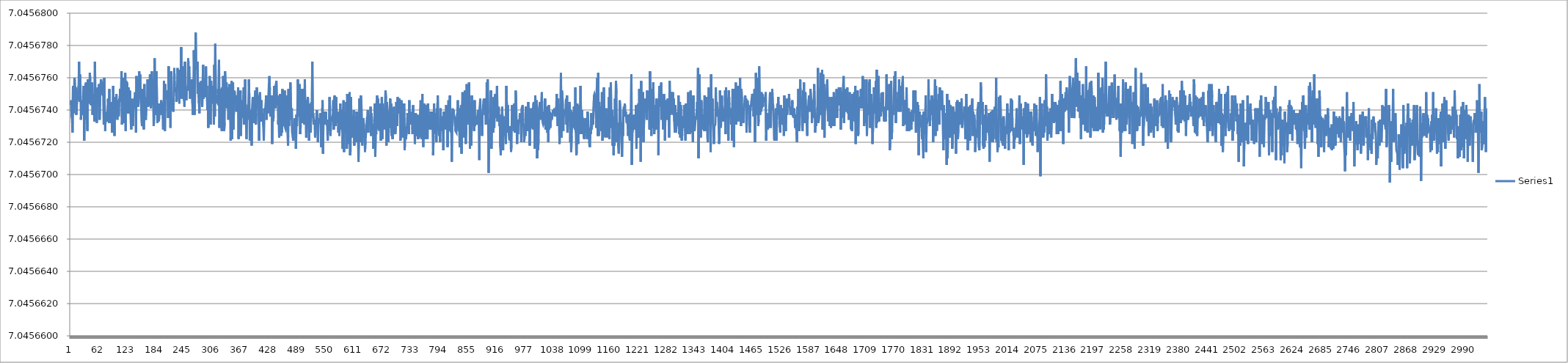
| Category | Series 0 |
|---|---|
| 0 | 7.046 |
| 1 | 7.046 |
| 2 | 7.046 |
| 3 | 7.046 |
| 4 | 7.046 |
| 5 | 7.046 |
| 6 | 7.046 |
| 7 | 7.046 |
| 8 | 7.046 |
| 9 | 7.046 |
| 10 | 7.046 |
| 11 | 7.046 |
| 12 | 7.046 |
| 13 | 7.046 |
| 14 | 7.046 |
| 15 | 7.046 |
| 16 | 7.046 |
| 17 | 7.046 |
| 18 | 7.046 |
| 19 | 7.046 |
| 20 | 7.046 |
| 21 | 7.046 |
| 22 | 7.046 |
| 23 | 7.046 |
| 24 | 7.046 |
| 25 | 7.046 |
| 26 | 7.046 |
| 27 | 7.046 |
| 28 | 7.046 |
| 29 | 7.046 |
| 30 | 7.046 |
| 31 | 7.046 |
| 32 | 7.046 |
| 33 | 7.046 |
| 34 | 7.046 |
| 35 | 7.046 |
| 36 | 7.046 |
| 37 | 7.046 |
| 38 | 7.046 |
| 39 | 7.046 |
| 40 | 7.046 |
| 41 | 7.046 |
| 42 | 7.046 |
| 43 | 7.046 |
| 44 | 7.046 |
| 45 | 7.046 |
| 46 | 7.046 |
| 47 | 7.046 |
| 48 | 7.046 |
| 49 | 7.046 |
| 50 | 7.046 |
| 51 | 7.046 |
| 52 | 7.046 |
| 53 | 7.046 |
| 54 | 7.046 |
| 55 | 7.046 |
| 56 | 7.046 |
| 57 | 7.046 |
| 58 | 7.046 |
| 59 | 7.046 |
| 60 | 7.046 |
| 61 | 7.046 |
| 62 | 7.046 |
| 63 | 7.046 |
| 64 | 7.046 |
| 65 | 7.046 |
| 66 | 7.046 |
| 67 | 7.046 |
| 68 | 7.046 |
| 69 | 7.046 |
| 70 | 7.046 |
| 71 | 7.046 |
| 72 | 7.046 |
| 73 | 7.046 |
| 74 | 7.046 |
| 75 | 7.046 |
| 76 | 7.046 |
| 77 | 7.046 |
| 78 | 7.046 |
| 79 | 7.046 |
| 80 | 7.046 |
| 81 | 7.046 |
| 82 | 7.046 |
| 83 | 7.046 |
| 84 | 7.046 |
| 85 | 7.046 |
| 86 | 7.046 |
| 87 | 7.046 |
| 88 | 7.046 |
| 89 | 7.046 |
| 90 | 7.046 |
| 91 | 7.046 |
| 92 | 7.046 |
| 93 | 7.046 |
| 94 | 7.046 |
| 95 | 7.046 |
| 96 | 7.046 |
| 97 | 7.046 |
| 98 | 7.046 |
| 99 | 7.046 |
| 100 | 7.046 |
| 101 | 7.046 |
| 102 | 7.046 |
| 103 | 7.046 |
| 104 | 7.046 |
| 105 | 7.046 |
| 106 | 7.046 |
| 107 | 7.046 |
| 108 | 7.046 |
| 109 | 7.046 |
| 110 | 7.046 |
| 111 | 7.046 |
| 112 | 7.046 |
| 113 | 7.046 |
| 114 | 7.046 |
| 115 | 7.046 |
| 116 | 7.046 |
| 117 | 7.046 |
| 118 | 7.046 |
| 119 | 7.046 |
| 120 | 7.046 |
| 121 | 7.046 |
| 122 | 7.046 |
| 123 | 7.046 |
| 124 | 7.046 |
| 125 | 7.046 |
| 126 | 7.046 |
| 127 | 7.046 |
| 128 | 7.046 |
| 129 | 7.046 |
| 130 | 7.046 |
| 131 | 7.046 |
| 132 | 7.046 |
| 133 | 7.046 |
| 134 | 7.046 |
| 135 | 7.046 |
| 136 | 7.046 |
| 137 | 7.046 |
| 138 | 7.046 |
| 139 | 7.046 |
| 140 | 7.046 |
| 141 | 7.046 |
| 142 | 7.046 |
| 143 | 7.046 |
| 144 | 7.046 |
| 145 | 7.046 |
| 146 | 7.046 |
| 147 | 7.046 |
| 148 | 7.046 |
| 149 | 7.046 |
| 150 | 7.046 |
| 151 | 7.046 |
| 152 | 7.046 |
| 153 | 7.046 |
| 154 | 7.046 |
| 155 | 7.046 |
| 156 | 7.046 |
| 157 | 7.046 |
| 158 | 7.046 |
| 159 | 7.046 |
| 160 | 7.046 |
| 161 | 7.046 |
| 162 | 7.046 |
| 163 | 7.046 |
| 164 | 7.046 |
| 165 | 7.046 |
| 166 | 7.046 |
| 167 | 7.046 |
| 168 | 7.046 |
| 169 | 7.046 |
| 170 | 7.046 |
| 171 | 7.046 |
| 172 | 7.046 |
| 173 | 7.046 |
| 174 | 7.046 |
| 175 | 7.046 |
| 176 | 7.046 |
| 177 | 7.046 |
| 178 | 7.046 |
| 179 | 7.046 |
| 180 | 7.046 |
| 181 | 7.046 |
| 182 | 7.046 |
| 183 | 7.046 |
| 184 | 7.046 |
| 185 | 7.046 |
| 186 | 7.046 |
| 187 | 7.046 |
| 188 | 7.046 |
| 189 | 7.046 |
| 190 | 7.046 |
| 191 | 7.046 |
| 192 | 7.046 |
| 193 | 7.046 |
| 194 | 7.046 |
| 195 | 7.046 |
| 196 | 7.046 |
| 197 | 7.046 |
| 198 | 7.046 |
| 199 | 7.046 |
| 200 | 7.046 |
| 201 | 7.046 |
| 202 | 7.046 |
| 203 | 7.046 |
| 204 | 7.046 |
| 205 | 7.046 |
| 206 | 7.046 |
| 207 | 7.046 |
| 208 | 7.046 |
| 209 | 7.046 |
| 210 | 7.046 |
| 211 | 7.046 |
| 212 | 7.046 |
| 213 | 7.046 |
| 214 | 7.046 |
| 215 | 7.046 |
| 216 | 7.046 |
| 217 | 7.046 |
| 218 | 7.046 |
| 219 | 7.046 |
| 220 | 7.046 |
| 221 | 7.046 |
| 222 | 7.046 |
| 223 | 7.046 |
| 224 | 7.046 |
| 225 | 7.046 |
| 226 | 7.046 |
| 227 | 7.046 |
| 228 | 7.046 |
| 229 | 7.046 |
| 230 | 7.046 |
| 231 | 7.046 |
| 232 | 7.046 |
| 233 | 7.046 |
| 234 | 7.046 |
| 235 | 7.046 |
| 236 | 7.046 |
| 237 | 7.046 |
| 238 | 7.046 |
| 239 | 7.046 |
| 240 | 7.046 |
| 241 | 7.046 |
| 242 | 7.046 |
| 243 | 7.046 |
| 244 | 7.046 |
| 245 | 7.046 |
| 246 | 7.046 |
| 247 | 7.046 |
| 248 | 7.046 |
| 249 | 7.046 |
| 250 | 7.046 |
| 251 | 7.046 |
| 252 | 7.046 |
| 253 | 7.046 |
| 254 | 7.046 |
| 255 | 7.046 |
| 256 | 7.046 |
| 257 | 7.046 |
| 258 | 7.046 |
| 259 | 7.046 |
| 260 | 7.046 |
| 261 | 7.046 |
| 262 | 7.046 |
| 263 | 7.046 |
| 264 | 7.046 |
| 265 | 7.046 |
| 266 | 7.046 |
| 267 | 7.046 |
| 268 | 7.046 |
| 269 | 7.046 |
| 270 | 7.046 |
| 271 | 7.046 |
| 272 | 7.046 |
| 273 | 7.046 |
| 274 | 7.046 |
| 275 | 7.046 |
| 276 | 7.046 |
| 277 | 7.046 |
| 278 | 7.046 |
| 279 | 7.046 |
| 280 | 7.046 |
| 281 | 7.046 |
| 282 | 7.046 |
| 283 | 7.046 |
| 284 | 7.046 |
| 285 | 7.046 |
| 286 | 7.046 |
| 287 | 7.046 |
| 288 | 7.046 |
| 289 | 7.046 |
| 290 | 7.046 |
| 291 | 7.046 |
| 292 | 7.046 |
| 293 | 7.046 |
| 294 | 7.046 |
| 295 | 7.046 |
| 296 | 7.046 |
| 297 | 7.046 |
| 298 | 7.046 |
| 299 | 7.046 |
| 300 | 7.046 |
| 301 | 7.046 |
| 302 | 7.046 |
| 303 | 7.046 |
| 304 | 7.046 |
| 305 | 7.046 |
| 306 | 7.046 |
| 307 | 7.046 |
| 308 | 7.046 |
| 309 | 7.046 |
| 310 | 7.046 |
| 311 | 7.046 |
| 312 | 7.046 |
| 313 | 7.046 |
| 314 | 7.046 |
| 315 | 7.046 |
| 316 | 7.046 |
| 317 | 7.046 |
| 318 | 7.046 |
| 319 | 7.046 |
| 320 | 7.046 |
| 321 | 7.046 |
| 322 | 7.046 |
| 323 | 7.046 |
| 324 | 7.046 |
| 325 | 7.046 |
| 326 | 7.046 |
| 327 | 7.046 |
| 328 | 7.046 |
| 329 | 7.046 |
| 330 | 7.046 |
| 331 | 7.046 |
| 332 | 7.046 |
| 333 | 7.046 |
| 334 | 7.046 |
| 335 | 7.046 |
| 336 | 7.046 |
| 337 | 7.046 |
| 338 | 7.046 |
| 339 | 7.046 |
| 340 | 7.046 |
| 341 | 7.046 |
| 342 | 7.046 |
| 343 | 7.046 |
| 344 | 7.046 |
| 345 | 7.046 |
| 346 | 7.046 |
| 347 | 7.046 |
| 348 | 7.046 |
| 349 | 7.046 |
| 350 | 7.046 |
| 351 | 7.046 |
| 352 | 7.046 |
| 353 | 7.046 |
| 354 | 7.046 |
| 355 | 7.046 |
| 356 | 7.046 |
| 357 | 7.046 |
| 358 | 7.046 |
| 359 | 7.046 |
| 360 | 7.046 |
| 361 | 7.046 |
| 362 | 7.046 |
| 363 | 7.046 |
| 364 | 7.046 |
| 365 | 7.046 |
| 366 | 7.046 |
| 367 | 7.046 |
| 368 | 7.046 |
| 369 | 7.046 |
| 370 | 7.046 |
| 371 | 7.046 |
| 372 | 7.046 |
| 373 | 7.046 |
| 374 | 7.046 |
| 375 | 7.046 |
| 376 | 7.046 |
| 377 | 7.046 |
| 378 | 7.046 |
| 379 | 7.046 |
| 380 | 7.046 |
| 381 | 7.046 |
| 382 | 7.046 |
| 383 | 7.046 |
| 384 | 7.046 |
| 385 | 7.046 |
| 386 | 7.046 |
| 387 | 7.046 |
| 388 | 7.046 |
| 389 | 7.046 |
| 390 | 7.046 |
| 391 | 7.046 |
| 392 | 7.046 |
| 393 | 7.046 |
| 394 | 7.046 |
| 395 | 7.046 |
| 396 | 7.046 |
| 397 | 7.046 |
| 398 | 7.046 |
| 399 | 7.046 |
| 400 | 7.046 |
| 401 | 7.046 |
| 402 | 7.046 |
| 403 | 7.046 |
| 404 | 7.046 |
| 405 | 7.046 |
| 406 | 7.046 |
| 407 | 7.046 |
| 408 | 7.046 |
| 409 | 7.046 |
| 410 | 7.046 |
| 411 | 7.046 |
| 412 | 7.046 |
| 413 | 7.046 |
| 414 | 7.046 |
| 415 | 7.046 |
| 416 | 7.046 |
| 417 | 7.046 |
| 418 | 7.046 |
| 419 | 7.046 |
| 420 | 7.046 |
| 421 | 7.046 |
| 422 | 7.046 |
| 423 | 7.046 |
| 424 | 7.046 |
| 425 | 7.046 |
| 426 | 7.046 |
| 427 | 7.046 |
| 428 | 7.046 |
| 429 | 7.046 |
| 430 | 7.046 |
| 431 | 7.046 |
| 432 | 7.046 |
| 433 | 7.046 |
| 434 | 7.046 |
| 435 | 7.046 |
| 436 | 7.046 |
| 437 | 7.046 |
| 438 | 7.046 |
| 439 | 7.046 |
| 440 | 7.046 |
| 441 | 7.046 |
| 442 | 7.046 |
| 443 | 7.046 |
| 444 | 7.046 |
| 445 | 7.046 |
| 446 | 7.046 |
| 447 | 7.046 |
| 448 | 7.046 |
| 449 | 7.046 |
| 450 | 7.046 |
| 451 | 7.046 |
| 452 | 7.046 |
| 453 | 7.046 |
| 454 | 7.046 |
| 455 | 7.046 |
| 456 | 7.046 |
| 457 | 7.046 |
| 458 | 7.046 |
| 459 | 7.046 |
| 460 | 7.046 |
| 461 | 7.046 |
| 462 | 7.046 |
| 463 | 7.046 |
| 464 | 7.046 |
| 465 | 7.046 |
| 466 | 7.046 |
| 467 | 7.046 |
| 468 | 7.046 |
| 469 | 7.046 |
| 470 | 7.046 |
| 471 | 7.046 |
| 472 | 7.046 |
| 473 | 7.046 |
| 474 | 7.046 |
| 475 | 7.046 |
| 476 | 7.046 |
| 477 | 7.046 |
| 478 | 7.046 |
| 479 | 7.046 |
| 480 | 7.046 |
| 481 | 7.046 |
| 482 | 7.046 |
| 483 | 7.046 |
| 484 | 7.046 |
| 485 | 7.046 |
| 486 | 7.046 |
| 487 | 7.046 |
| 488 | 7.046 |
| 489 | 7.046 |
| 490 | 7.046 |
| 491 | 7.046 |
| 492 | 7.046 |
| 493 | 7.046 |
| 494 | 7.046 |
| 495 | 7.046 |
| 496 | 7.046 |
| 497 | 7.046 |
| 498 | 7.046 |
| 499 | 7.046 |
| 500 | 7.046 |
| 501 | 7.046 |
| 502 | 7.046 |
| 503 | 7.046 |
| 504 | 7.046 |
| 505 | 7.046 |
| 506 | 7.046 |
| 507 | 7.046 |
| 508 | 7.046 |
| 509 | 7.046 |
| 510 | 7.046 |
| 511 | 7.046 |
| 512 | 7.046 |
| 513 | 7.046 |
| 514 | 7.046 |
| 515 | 7.046 |
| 516 | 7.046 |
| 517 | 7.046 |
| 518 | 7.046 |
| 519 | 7.046 |
| 520 | 7.046 |
| 521 | 7.046 |
| 522 | 7.046 |
| 523 | 7.046 |
| 524 | 7.046 |
| 525 | 7.046 |
| 526 | 7.046 |
| 527 | 7.046 |
| 528 | 7.046 |
| 529 | 7.046 |
| 530 | 7.046 |
| 531 | 7.046 |
| 532 | 7.046 |
| 533 | 7.046 |
| 534 | 7.046 |
| 535 | 7.046 |
| 536 | 7.046 |
| 537 | 7.046 |
| 538 | 7.046 |
| 539 | 7.046 |
| 540 | 7.046 |
| 541 | 7.046 |
| 542 | 7.046 |
| 543 | 7.046 |
| 544 | 7.046 |
| 545 | 7.046 |
| 546 | 7.046 |
| 547 | 7.046 |
| 548 | 7.046 |
| 549 | 7.046 |
| 550 | 7.046 |
| 551 | 7.046 |
| 552 | 7.046 |
| 553 | 7.046 |
| 554 | 7.046 |
| 555 | 7.046 |
| 556 | 7.046 |
| 557 | 7.046 |
| 558 | 7.046 |
| 559 | 7.046 |
| 560 | 7.046 |
| 561 | 7.046 |
| 562 | 7.046 |
| 563 | 7.046 |
| 564 | 7.046 |
| 565 | 7.046 |
| 566 | 7.046 |
| 567 | 7.046 |
| 568 | 7.046 |
| 569 | 7.046 |
| 570 | 7.046 |
| 571 | 7.046 |
| 572 | 7.046 |
| 573 | 7.046 |
| 574 | 7.046 |
| 575 | 7.046 |
| 576 | 7.046 |
| 577 | 7.046 |
| 578 | 7.046 |
| 579 | 7.046 |
| 580 | 7.046 |
| 581 | 7.046 |
| 582 | 7.046 |
| 583 | 7.046 |
| 584 | 7.046 |
| 585 | 7.046 |
| 586 | 7.046 |
| 587 | 7.046 |
| 588 | 7.046 |
| 589 | 7.046 |
| 590 | 7.046 |
| 591 | 7.046 |
| 592 | 7.046 |
| 593 | 7.046 |
| 594 | 7.046 |
| 595 | 7.046 |
| 596 | 7.046 |
| 597 | 7.046 |
| 598 | 7.046 |
| 599 | 7.046 |
| 600 | 7.046 |
| 601 | 7.046 |
| 602 | 7.046 |
| 603 | 7.046 |
| 604 | 7.046 |
| 605 | 7.046 |
| 606 | 7.046 |
| 607 | 7.046 |
| 608 | 7.046 |
| 609 | 7.046 |
| 610 | 7.046 |
| 611 | 7.046 |
| 612 | 7.046 |
| 613 | 7.046 |
| 614 | 7.046 |
| 615 | 7.046 |
| 616 | 7.046 |
| 617 | 7.046 |
| 618 | 7.046 |
| 619 | 7.046 |
| 620 | 7.046 |
| 621 | 7.046 |
| 622 | 7.046 |
| 623 | 7.046 |
| 624 | 7.046 |
| 625 | 7.046 |
| 626 | 7.046 |
| 627 | 7.046 |
| 628 | 7.046 |
| 629 | 7.046 |
| 630 | 7.046 |
| 631 | 7.046 |
| 632 | 7.046 |
| 633 | 7.046 |
| 634 | 7.046 |
| 635 | 7.046 |
| 636 | 7.046 |
| 637 | 7.046 |
| 638 | 7.046 |
| 639 | 7.046 |
| 640 | 7.046 |
| 641 | 7.046 |
| 642 | 7.046 |
| 643 | 7.046 |
| 644 | 7.046 |
| 645 | 7.046 |
| 646 | 7.046 |
| 647 | 7.046 |
| 648 | 7.046 |
| 649 | 7.046 |
| 650 | 7.046 |
| 651 | 7.046 |
| 652 | 7.046 |
| 653 | 7.046 |
| 654 | 7.046 |
| 655 | 7.046 |
| 656 | 7.046 |
| 657 | 7.046 |
| 658 | 7.046 |
| 659 | 7.046 |
| 660 | 7.046 |
| 661 | 7.046 |
| 662 | 7.046 |
| 663 | 7.046 |
| 664 | 7.046 |
| 665 | 7.046 |
| 666 | 7.046 |
| 667 | 7.046 |
| 668 | 7.046 |
| 669 | 7.046 |
| 670 | 7.046 |
| 671 | 7.046 |
| 672 | 7.046 |
| 673 | 7.046 |
| 674 | 7.046 |
| 675 | 7.046 |
| 676 | 7.046 |
| 677 | 7.046 |
| 678 | 7.046 |
| 679 | 7.046 |
| 680 | 7.046 |
| 681 | 7.046 |
| 682 | 7.046 |
| 683 | 7.046 |
| 684 | 7.046 |
| 685 | 7.046 |
| 686 | 7.046 |
| 687 | 7.046 |
| 688 | 7.046 |
| 689 | 7.046 |
| 690 | 7.046 |
| 691 | 7.046 |
| 692 | 7.046 |
| 693 | 7.046 |
| 694 | 7.046 |
| 695 | 7.046 |
| 696 | 7.046 |
| 697 | 7.046 |
| 698 | 7.046 |
| 699 | 7.046 |
| 700 | 7.046 |
| 701 | 7.046 |
| 702 | 7.046 |
| 703 | 7.046 |
| 704 | 7.046 |
| 705 | 7.046 |
| 706 | 7.046 |
| 707 | 7.046 |
| 708 | 7.046 |
| 709 | 7.046 |
| 710 | 7.046 |
| 711 | 7.046 |
| 712 | 7.046 |
| 713 | 7.046 |
| 714 | 7.046 |
| 715 | 7.046 |
| 716 | 7.046 |
| 717 | 7.046 |
| 718 | 7.046 |
| 719 | 7.046 |
| 720 | 7.046 |
| 721 | 7.046 |
| 722 | 7.046 |
| 723 | 7.046 |
| 724 | 7.046 |
| 725 | 7.046 |
| 726 | 7.046 |
| 727 | 7.046 |
| 728 | 7.046 |
| 729 | 7.046 |
| 730 | 7.046 |
| 731 | 7.046 |
| 732 | 7.046 |
| 733 | 7.046 |
| 734 | 7.046 |
| 735 | 7.046 |
| 736 | 7.046 |
| 737 | 7.046 |
| 738 | 7.046 |
| 739 | 7.046 |
| 740 | 7.046 |
| 741 | 7.046 |
| 742 | 7.046 |
| 743 | 7.046 |
| 744 | 7.046 |
| 745 | 7.046 |
| 746 | 7.046 |
| 747 | 7.046 |
| 748 | 7.046 |
| 749 | 7.046 |
| 750 | 7.046 |
| 751 | 7.046 |
| 752 | 7.046 |
| 753 | 7.046 |
| 754 | 7.046 |
| 755 | 7.046 |
| 756 | 7.046 |
| 757 | 7.046 |
| 758 | 7.046 |
| 759 | 7.046 |
| 760 | 7.046 |
| 761 | 7.046 |
| 762 | 7.046 |
| 763 | 7.046 |
| 764 | 7.046 |
| 765 | 7.046 |
| 766 | 7.046 |
| 767 | 7.046 |
| 768 | 7.046 |
| 769 | 7.046 |
| 770 | 7.046 |
| 771 | 7.046 |
| 772 | 7.046 |
| 773 | 7.046 |
| 774 | 7.046 |
| 775 | 7.046 |
| 776 | 7.046 |
| 777 | 7.046 |
| 778 | 7.046 |
| 779 | 7.046 |
| 780 | 7.046 |
| 781 | 7.046 |
| 782 | 7.046 |
| 783 | 7.046 |
| 784 | 7.046 |
| 785 | 7.046 |
| 786 | 7.046 |
| 787 | 7.046 |
| 788 | 7.046 |
| 789 | 7.046 |
| 790 | 7.046 |
| 791 | 7.046 |
| 792 | 7.046 |
| 793 | 7.046 |
| 794 | 7.046 |
| 795 | 7.046 |
| 796 | 7.046 |
| 797 | 7.046 |
| 798 | 7.046 |
| 799 | 7.046 |
| 800 | 7.046 |
| 801 | 7.046 |
| 802 | 7.046 |
| 803 | 7.046 |
| 804 | 7.046 |
| 805 | 7.046 |
| 806 | 7.046 |
| 807 | 7.046 |
| 808 | 7.046 |
| 809 | 7.046 |
| 810 | 7.046 |
| 811 | 7.046 |
| 812 | 7.046 |
| 813 | 7.046 |
| 814 | 7.046 |
| 815 | 7.046 |
| 816 | 7.046 |
| 817 | 7.046 |
| 818 | 7.046 |
| 819 | 7.046 |
| 820 | 7.046 |
| 821 | 7.046 |
| 822 | 7.046 |
| 823 | 7.046 |
| 824 | 7.046 |
| 825 | 7.046 |
| 826 | 7.046 |
| 827 | 7.046 |
| 828 | 7.046 |
| 829 | 7.046 |
| 830 | 7.046 |
| 831 | 7.046 |
| 832 | 7.046 |
| 833 | 7.046 |
| 834 | 7.046 |
| 835 | 7.046 |
| 836 | 7.046 |
| 837 | 7.046 |
| 838 | 7.046 |
| 839 | 7.046 |
| 840 | 7.046 |
| 841 | 7.046 |
| 842 | 7.046 |
| 843 | 7.046 |
| 844 | 7.046 |
| 845 | 7.046 |
| 846 | 7.046 |
| 847 | 7.046 |
| 848 | 7.046 |
| 849 | 7.046 |
| 850 | 7.046 |
| 851 | 7.046 |
| 852 | 7.046 |
| 853 | 7.046 |
| 854 | 7.046 |
| 855 | 7.046 |
| 856 | 7.046 |
| 857 | 7.046 |
| 858 | 7.046 |
| 859 | 7.046 |
| 860 | 7.046 |
| 861 | 7.046 |
| 862 | 7.046 |
| 863 | 7.046 |
| 864 | 7.046 |
| 865 | 7.046 |
| 866 | 7.046 |
| 867 | 7.046 |
| 868 | 7.046 |
| 869 | 7.046 |
| 870 | 7.046 |
| 871 | 7.046 |
| 872 | 7.046 |
| 873 | 7.046 |
| 874 | 7.046 |
| 875 | 7.046 |
| 876 | 7.046 |
| 877 | 7.046 |
| 878 | 7.046 |
| 879 | 7.046 |
| 880 | 7.046 |
| 881 | 7.046 |
| 882 | 7.046 |
| 883 | 7.046 |
| 884 | 7.046 |
| 885 | 7.046 |
| 886 | 7.046 |
| 887 | 7.046 |
| 888 | 7.046 |
| 889 | 7.046 |
| 890 | 7.046 |
| 891 | 7.046 |
| 892 | 7.046 |
| 893 | 7.046 |
| 894 | 7.046 |
| 895 | 7.046 |
| 896 | 7.046 |
| 897 | 7.046 |
| 898 | 7.046 |
| 899 | 7.046 |
| 900 | 7.046 |
| 901 | 7.046 |
| 902 | 7.046 |
| 903 | 7.046 |
| 904 | 7.046 |
| 905 | 7.046 |
| 906 | 7.046 |
| 907 | 7.046 |
| 908 | 7.046 |
| 909 | 7.046 |
| 910 | 7.046 |
| 911 | 7.046 |
| 912 | 7.046 |
| 913 | 7.046 |
| 914 | 7.046 |
| 915 | 7.046 |
| 916 | 7.046 |
| 917 | 7.046 |
| 918 | 7.046 |
| 919 | 7.046 |
| 920 | 7.046 |
| 921 | 7.046 |
| 922 | 7.046 |
| 923 | 7.046 |
| 924 | 7.046 |
| 925 | 7.046 |
| 926 | 7.046 |
| 927 | 7.046 |
| 928 | 7.046 |
| 929 | 7.046 |
| 930 | 7.046 |
| 931 | 7.046 |
| 932 | 7.046 |
| 933 | 7.046 |
| 934 | 7.046 |
| 935 | 7.046 |
| 936 | 7.046 |
| 937 | 7.046 |
| 938 | 7.046 |
| 939 | 7.046 |
| 940 | 7.046 |
| 941 | 7.046 |
| 942 | 7.046 |
| 943 | 7.046 |
| 944 | 7.046 |
| 945 | 7.046 |
| 946 | 7.046 |
| 947 | 7.046 |
| 948 | 7.046 |
| 949 | 7.046 |
| 950 | 7.046 |
| 951 | 7.046 |
| 952 | 7.046 |
| 953 | 7.046 |
| 954 | 7.046 |
| 955 | 7.046 |
| 956 | 7.046 |
| 957 | 7.046 |
| 958 | 7.046 |
| 959 | 7.046 |
| 960 | 7.046 |
| 961 | 7.046 |
| 962 | 7.046 |
| 963 | 7.046 |
| 964 | 7.046 |
| 965 | 7.046 |
| 966 | 7.046 |
| 967 | 7.046 |
| 968 | 7.046 |
| 969 | 7.046 |
| 970 | 7.046 |
| 971 | 7.046 |
| 972 | 7.046 |
| 973 | 7.046 |
| 974 | 7.046 |
| 975 | 7.046 |
| 976 | 7.046 |
| 977 | 7.046 |
| 978 | 7.046 |
| 979 | 7.046 |
| 980 | 7.046 |
| 981 | 7.046 |
| 982 | 7.046 |
| 983 | 7.046 |
| 984 | 7.046 |
| 985 | 7.046 |
| 986 | 7.046 |
| 987 | 7.046 |
| 988 | 7.046 |
| 989 | 7.046 |
| 990 | 7.046 |
| 991 | 7.046 |
| 992 | 7.046 |
| 993 | 7.046 |
| 994 | 7.046 |
| 995 | 7.046 |
| 996 | 7.046 |
| 997 | 7.046 |
| 998 | 7.046 |
| 999 | 7.046 |
| 1000 | 7.046 |
| 1001 | 7.046 |
| 1002 | 7.046 |
| 1003 | 7.046 |
| 1004 | 7.046 |
| 1005 | 7.046 |
| 1006 | 7.046 |
| 1007 | 7.046 |
| 1008 | 7.046 |
| 1009 | 7.046 |
| 1010 | 7.046 |
| 1011 | 7.046 |
| 1012 | 7.046 |
| 1013 | 7.046 |
| 1014 | 7.046 |
| 1015 | 7.046 |
| 1016 | 7.046 |
| 1017 | 7.046 |
| 1018 | 7.046 |
| 1019 | 7.046 |
| 1020 | 7.046 |
| 1021 | 7.046 |
| 1022 | 7.046 |
| 1023 | 7.046 |
| 1024 | 7.046 |
| 1025 | 7.046 |
| 1026 | 7.046 |
| 1027 | 7.046 |
| 1028 | 7.046 |
| 1029 | 7.046 |
| 1030 | 7.046 |
| 1031 | 7.046 |
| 1032 | 7.046 |
| 1033 | 7.046 |
| 1034 | 7.046 |
| 1035 | 7.046 |
| 1036 | 7.046 |
| 1037 | 7.046 |
| 1038 | 7.046 |
| 1039 | 7.046 |
| 1040 | 7.046 |
| 1041 | 7.046 |
| 1042 | 7.046 |
| 1043 | 7.046 |
| 1044 | 7.046 |
| 1045 | 7.046 |
| 1046 | 7.046 |
| 1047 | 7.046 |
| 1048 | 7.046 |
| 1049 | 7.046 |
| 1050 | 7.046 |
| 1051 | 7.046 |
| 1052 | 7.046 |
| 1053 | 7.046 |
| 1054 | 7.046 |
| 1055 | 7.046 |
| 1056 | 7.046 |
| 1057 | 7.046 |
| 1058 | 7.046 |
| 1059 | 7.046 |
| 1060 | 7.046 |
| 1061 | 7.046 |
| 1062 | 7.046 |
| 1063 | 7.046 |
| 1064 | 7.046 |
| 1065 | 7.046 |
| 1066 | 7.046 |
| 1067 | 7.046 |
| 1068 | 7.046 |
| 1069 | 7.046 |
| 1070 | 7.046 |
| 1071 | 7.046 |
| 1072 | 7.046 |
| 1073 | 7.046 |
| 1074 | 7.046 |
| 1075 | 7.046 |
| 1076 | 7.046 |
| 1077 | 7.046 |
| 1078 | 7.046 |
| 1079 | 7.046 |
| 1080 | 7.046 |
| 1081 | 7.046 |
| 1082 | 7.046 |
| 1083 | 7.046 |
| 1084 | 7.046 |
| 1085 | 7.046 |
| 1086 | 7.046 |
| 1087 | 7.046 |
| 1088 | 7.046 |
| 1089 | 7.046 |
| 1090 | 7.046 |
| 1091 | 7.046 |
| 1092 | 7.046 |
| 1093 | 7.046 |
| 1094 | 7.046 |
| 1095 | 7.046 |
| 1096 | 7.046 |
| 1097 | 7.046 |
| 1098 | 7.046 |
| 1099 | 7.046 |
| 1100 | 7.046 |
| 1101 | 7.046 |
| 1102 | 7.046 |
| 1103 | 7.046 |
| 1104 | 7.046 |
| 1105 | 7.046 |
| 1106 | 7.046 |
| 1107 | 7.046 |
| 1108 | 7.046 |
| 1109 | 7.046 |
| 1110 | 7.046 |
| 1111 | 7.046 |
| 1112 | 7.046 |
| 1113 | 7.046 |
| 1114 | 7.046 |
| 1115 | 7.046 |
| 1116 | 7.046 |
| 1117 | 7.046 |
| 1118 | 7.046 |
| 1119 | 7.046 |
| 1120 | 7.046 |
| 1121 | 7.046 |
| 1122 | 7.046 |
| 1123 | 7.046 |
| 1124 | 7.046 |
| 1125 | 7.046 |
| 1126 | 7.046 |
| 1127 | 7.046 |
| 1128 | 7.046 |
| 1129 | 7.046 |
| 1130 | 7.046 |
| 1131 | 7.046 |
| 1132 | 7.046 |
| 1133 | 7.046 |
| 1134 | 7.046 |
| 1135 | 7.046 |
| 1136 | 7.046 |
| 1137 | 7.046 |
| 1138 | 7.046 |
| 1139 | 7.046 |
| 1140 | 7.046 |
| 1141 | 7.046 |
| 1142 | 7.046 |
| 1143 | 7.046 |
| 1144 | 7.046 |
| 1145 | 7.046 |
| 1146 | 7.046 |
| 1147 | 7.046 |
| 1148 | 7.046 |
| 1149 | 7.046 |
| 1150 | 7.046 |
| 1151 | 7.046 |
| 1152 | 7.046 |
| 1153 | 7.046 |
| 1154 | 7.046 |
| 1155 | 7.046 |
| 1156 | 7.046 |
| 1157 | 7.046 |
| 1158 | 7.046 |
| 1159 | 7.046 |
| 1160 | 7.046 |
| 1161 | 7.046 |
| 1162 | 7.046 |
| 1163 | 7.046 |
| 1164 | 7.046 |
| 1165 | 7.046 |
| 1166 | 7.046 |
| 1167 | 7.046 |
| 1168 | 7.046 |
| 1169 | 7.046 |
| 1170 | 7.046 |
| 1171 | 7.046 |
| 1172 | 7.046 |
| 1173 | 7.046 |
| 1174 | 7.046 |
| 1175 | 7.046 |
| 1176 | 7.046 |
| 1177 | 7.046 |
| 1178 | 7.046 |
| 1179 | 7.046 |
| 1180 | 7.046 |
| 1181 | 7.046 |
| 1182 | 7.046 |
| 1183 | 7.046 |
| 1184 | 7.046 |
| 1185 | 7.046 |
| 1186 | 7.046 |
| 1187 | 7.046 |
| 1188 | 7.046 |
| 1189 | 7.046 |
| 1190 | 7.046 |
| 1191 | 7.046 |
| 1192 | 7.046 |
| 1193 | 7.046 |
| 1194 | 7.046 |
| 1195 | 7.046 |
| 1196 | 7.046 |
| 1197 | 7.046 |
| 1198 | 7.046 |
| 1199 | 7.046 |
| 1200 | 7.046 |
| 1201 | 7.046 |
| 1202 | 7.046 |
| 1203 | 7.046 |
| 1204 | 7.046 |
| 1205 | 7.046 |
| 1206 | 7.046 |
| 1207 | 7.046 |
| 1208 | 7.046 |
| 1209 | 7.046 |
| 1210 | 7.046 |
| 1211 | 7.046 |
| 1212 | 7.046 |
| 1213 | 7.046 |
| 1214 | 7.046 |
| 1215 | 7.046 |
| 1216 | 7.046 |
| 1217 | 7.046 |
| 1218 | 7.046 |
| 1219 | 7.046 |
| 1220 | 7.046 |
| 1221 | 7.046 |
| 1222 | 7.046 |
| 1223 | 7.046 |
| 1224 | 7.046 |
| 1225 | 7.046 |
| 1226 | 7.046 |
| 1227 | 7.046 |
| 1228 | 7.046 |
| 1229 | 7.046 |
| 1230 | 7.046 |
| 1231 | 7.046 |
| 1232 | 7.046 |
| 1233 | 7.046 |
| 1234 | 7.046 |
| 1235 | 7.046 |
| 1236 | 7.046 |
| 1237 | 7.046 |
| 1238 | 7.046 |
| 1239 | 7.046 |
| 1240 | 7.046 |
| 1241 | 7.046 |
| 1242 | 7.046 |
| 1243 | 7.046 |
| 1244 | 7.046 |
| 1245 | 7.046 |
| 1246 | 7.046 |
| 1247 | 7.046 |
| 1248 | 7.046 |
| 1249 | 7.046 |
| 1250 | 7.046 |
| 1251 | 7.046 |
| 1252 | 7.046 |
| 1253 | 7.046 |
| 1254 | 7.046 |
| 1255 | 7.046 |
| 1256 | 7.046 |
| 1257 | 7.046 |
| 1258 | 7.046 |
| 1259 | 7.046 |
| 1260 | 7.046 |
| 1261 | 7.046 |
| 1262 | 7.046 |
| 1263 | 7.046 |
| 1264 | 7.046 |
| 1265 | 7.046 |
| 1266 | 7.046 |
| 1267 | 7.046 |
| 1268 | 7.046 |
| 1269 | 7.046 |
| 1270 | 7.046 |
| 1271 | 7.046 |
| 1272 | 7.046 |
| 1273 | 7.046 |
| 1274 | 7.046 |
| 1275 | 7.046 |
| 1276 | 7.046 |
| 1277 | 7.046 |
| 1278 | 7.046 |
| 1279 | 7.046 |
| 1280 | 7.046 |
| 1281 | 7.046 |
| 1282 | 7.046 |
| 1283 | 7.046 |
| 1284 | 7.046 |
| 1285 | 7.046 |
| 1286 | 7.046 |
| 1287 | 7.046 |
| 1288 | 7.046 |
| 1289 | 7.046 |
| 1290 | 7.046 |
| 1291 | 7.046 |
| 1292 | 7.046 |
| 1293 | 7.046 |
| 1294 | 7.046 |
| 1295 | 7.046 |
| 1296 | 7.046 |
| 1297 | 7.046 |
| 1298 | 7.046 |
| 1299 | 7.046 |
| 1300 | 7.046 |
| 1301 | 7.046 |
| 1302 | 7.046 |
| 1303 | 7.046 |
| 1304 | 7.046 |
| 1305 | 7.046 |
| 1306 | 7.046 |
| 1307 | 7.046 |
| 1308 | 7.046 |
| 1309 | 7.046 |
| 1310 | 7.046 |
| 1311 | 7.046 |
| 1312 | 7.046 |
| 1313 | 7.046 |
| 1314 | 7.046 |
| 1315 | 7.046 |
| 1316 | 7.046 |
| 1317 | 7.046 |
| 1318 | 7.046 |
| 1319 | 7.046 |
| 1320 | 7.046 |
| 1321 | 7.046 |
| 1322 | 7.046 |
| 1323 | 7.046 |
| 1324 | 7.046 |
| 1325 | 7.046 |
| 1326 | 7.046 |
| 1327 | 7.046 |
| 1328 | 7.046 |
| 1329 | 7.046 |
| 1330 | 7.046 |
| 1331 | 7.046 |
| 1332 | 7.046 |
| 1333 | 7.046 |
| 1334 | 7.046 |
| 1335 | 7.046 |
| 1336 | 7.046 |
| 1337 | 7.046 |
| 1338 | 7.046 |
| 1339 | 7.046 |
| 1340 | 7.046 |
| 1341 | 7.046 |
| 1342 | 7.046 |
| 1343 | 7.046 |
| 1344 | 7.046 |
| 1345 | 7.046 |
| 1346 | 7.046 |
| 1347 | 7.046 |
| 1348 | 7.046 |
| 1349 | 7.046 |
| 1350 | 7.046 |
| 1351 | 7.046 |
| 1352 | 7.046 |
| 1353 | 7.046 |
| 1354 | 7.046 |
| 1355 | 7.046 |
| 1356 | 7.046 |
| 1357 | 7.046 |
| 1358 | 7.046 |
| 1359 | 7.046 |
| 1360 | 7.046 |
| 1361 | 7.046 |
| 1362 | 7.046 |
| 1363 | 7.046 |
| 1364 | 7.046 |
| 1365 | 7.046 |
| 1366 | 7.046 |
| 1367 | 7.046 |
| 1368 | 7.046 |
| 1369 | 7.046 |
| 1370 | 7.046 |
| 1371 | 7.046 |
| 1372 | 7.046 |
| 1373 | 7.046 |
| 1374 | 7.046 |
| 1375 | 7.046 |
| 1376 | 7.046 |
| 1377 | 7.046 |
| 1378 | 7.046 |
| 1379 | 7.046 |
| 1380 | 7.046 |
| 1381 | 7.046 |
| 1382 | 7.046 |
| 1383 | 7.046 |
| 1384 | 7.046 |
| 1385 | 7.046 |
| 1386 | 7.046 |
| 1387 | 7.046 |
| 1388 | 7.046 |
| 1389 | 7.046 |
| 1390 | 7.046 |
| 1391 | 7.046 |
| 1392 | 7.046 |
| 1393 | 7.046 |
| 1394 | 7.046 |
| 1395 | 7.046 |
| 1396 | 7.046 |
| 1397 | 7.046 |
| 1398 | 7.046 |
| 1399 | 7.046 |
| 1400 | 7.046 |
| 1401 | 7.046 |
| 1402 | 7.046 |
| 1403 | 7.046 |
| 1404 | 7.046 |
| 1405 | 7.046 |
| 1406 | 7.046 |
| 1407 | 7.046 |
| 1408 | 7.046 |
| 1409 | 7.046 |
| 1410 | 7.046 |
| 1411 | 7.046 |
| 1412 | 7.046 |
| 1413 | 7.046 |
| 1414 | 7.046 |
| 1415 | 7.046 |
| 1416 | 7.046 |
| 1417 | 7.046 |
| 1418 | 7.046 |
| 1419 | 7.046 |
| 1420 | 7.046 |
| 1421 | 7.046 |
| 1422 | 7.046 |
| 1423 | 7.046 |
| 1424 | 7.046 |
| 1425 | 7.046 |
| 1426 | 7.046 |
| 1427 | 7.046 |
| 1428 | 7.046 |
| 1429 | 7.046 |
| 1430 | 7.046 |
| 1431 | 7.046 |
| 1432 | 7.046 |
| 1433 | 7.046 |
| 1434 | 7.046 |
| 1435 | 7.046 |
| 1436 | 7.046 |
| 1437 | 7.046 |
| 1438 | 7.046 |
| 1439 | 7.046 |
| 1440 | 7.046 |
| 1441 | 7.046 |
| 1442 | 7.046 |
| 1443 | 7.046 |
| 1444 | 7.046 |
| 1445 | 7.046 |
| 1446 | 7.046 |
| 1447 | 7.046 |
| 1448 | 7.046 |
| 1449 | 7.046 |
| 1450 | 7.046 |
| 1451 | 7.046 |
| 1452 | 7.046 |
| 1453 | 7.046 |
| 1454 | 7.046 |
| 1455 | 7.046 |
| 1456 | 7.046 |
| 1457 | 7.046 |
| 1458 | 7.046 |
| 1459 | 7.046 |
| 1460 | 7.046 |
| 1461 | 7.046 |
| 1462 | 7.046 |
| 1463 | 7.046 |
| 1464 | 7.046 |
| 1465 | 7.046 |
| 1466 | 7.046 |
| 1467 | 7.046 |
| 1468 | 7.046 |
| 1469 | 7.046 |
| 1470 | 7.046 |
| 1471 | 7.046 |
| 1472 | 7.046 |
| 1473 | 7.046 |
| 1474 | 7.046 |
| 1475 | 7.046 |
| 1476 | 7.046 |
| 1477 | 7.046 |
| 1478 | 7.046 |
| 1479 | 7.046 |
| 1480 | 7.046 |
| 1481 | 7.046 |
| 1482 | 7.046 |
| 1483 | 7.046 |
| 1484 | 7.046 |
| 1485 | 7.046 |
| 1486 | 7.046 |
| 1487 | 7.046 |
| 1488 | 7.046 |
| 1489 | 7.046 |
| 1490 | 7.046 |
| 1491 | 7.046 |
| 1492 | 7.046 |
| 1493 | 7.046 |
| 1494 | 7.046 |
| 1495 | 7.046 |
| 1496 | 7.046 |
| 1497 | 7.046 |
| 1498 | 7.046 |
| 1499 | 7.046 |
| 1500 | 7.046 |
| 1501 | 7.046 |
| 1502 | 7.046 |
| 1503 | 7.046 |
| 1504 | 7.046 |
| 1505 | 7.046 |
| 1506 | 7.046 |
| 1507 | 7.046 |
| 1508 | 7.046 |
| 1509 | 7.046 |
| 1510 | 7.046 |
| 1511 | 7.046 |
| 1512 | 7.046 |
| 1513 | 7.046 |
| 1514 | 7.046 |
| 1515 | 7.046 |
| 1516 | 7.046 |
| 1517 | 7.046 |
| 1518 | 7.046 |
| 1519 | 7.046 |
| 1520 | 7.046 |
| 1521 | 7.046 |
| 1522 | 7.046 |
| 1523 | 7.046 |
| 1524 | 7.046 |
| 1525 | 7.046 |
| 1526 | 7.046 |
| 1527 | 7.046 |
| 1528 | 7.046 |
| 1529 | 7.046 |
| 1530 | 7.046 |
| 1531 | 7.046 |
| 1532 | 7.046 |
| 1533 | 7.046 |
| 1534 | 7.046 |
| 1535 | 7.046 |
| 1536 | 7.046 |
| 1537 | 7.046 |
| 1538 | 7.046 |
| 1539 | 7.046 |
| 1540 | 7.046 |
| 1541 | 7.046 |
| 1542 | 7.046 |
| 1543 | 7.046 |
| 1544 | 7.046 |
| 1545 | 7.046 |
| 1546 | 7.046 |
| 1547 | 7.046 |
| 1548 | 7.046 |
| 1549 | 7.046 |
| 1550 | 7.046 |
| 1551 | 7.046 |
| 1552 | 7.046 |
| 1553 | 7.046 |
| 1554 | 7.046 |
| 1555 | 7.046 |
| 1556 | 7.046 |
| 1557 | 7.046 |
| 1558 | 7.046 |
| 1559 | 7.046 |
| 1560 | 7.046 |
| 1561 | 7.046 |
| 1562 | 7.046 |
| 1563 | 7.046 |
| 1564 | 7.046 |
| 1565 | 7.046 |
| 1566 | 7.046 |
| 1567 | 7.046 |
| 1568 | 7.046 |
| 1569 | 7.046 |
| 1570 | 7.046 |
| 1571 | 7.046 |
| 1572 | 7.046 |
| 1573 | 7.046 |
| 1574 | 7.046 |
| 1575 | 7.046 |
| 1576 | 7.046 |
| 1577 | 7.046 |
| 1578 | 7.046 |
| 1579 | 7.046 |
| 1580 | 7.046 |
| 1581 | 7.046 |
| 1582 | 7.046 |
| 1583 | 7.046 |
| 1584 | 7.046 |
| 1585 | 7.046 |
| 1586 | 7.046 |
| 1587 | 7.046 |
| 1588 | 7.046 |
| 1589 | 7.046 |
| 1590 | 7.046 |
| 1591 | 7.046 |
| 1592 | 7.046 |
| 1593 | 7.046 |
| 1594 | 7.046 |
| 1595 | 7.046 |
| 1596 | 7.046 |
| 1597 | 7.046 |
| 1598 | 7.046 |
| 1599 | 7.046 |
| 1600 | 7.046 |
| 1601 | 7.046 |
| 1602 | 7.046 |
| 1603 | 7.046 |
| 1604 | 7.046 |
| 1605 | 7.046 |
| 1606 | 7.046 |
| 1607 | 7.046 |
| 1608 | 7.046 |
| 1609 | 7.046 |
| 1610 | 7.046 |
| 1611 | 7.046 |
| 1612 | 7.046 |
| 1613 | 7.046 |
| 1614 | 7.046 |
| 1615 | 7.046 |
| 1616 | 7.046 |
| 1617 | 7.046 |
| 1618 | 7.046 |
| 1619 | 7.046 |
| 1620 | 7.046 |
| 1621 | 7.046 |
| 1622 | 7.046 |
| 1623 | 7.046 |
| 1624 | 7.046 |
| 1625 | 7.046 |
| 1626 | 7.046 |
| 1627 | 7.046 |
| 1628 | 7.046 |
| 1629 | 7.046 |
| 1630 | 7.046 |
| 1631 | 7.046 |
| 1632 | 7.046 |
| 1633 | 7.046 |
| 1634 | 7.046 |
| 1635 | 7.046 |
| 1636 | 7.046 |
| 1637 | 7.046 |
| 1638 | 7.046 |
| 1639 | 7.046 |
| 1640 | 7.046 |
| 1641 | 7.046 |
| 1642 | 7.046 |
| 1643 | 7.046 |
| 1644 | 7.046 |
| 1645 | 7.046 |
| 1646 | 7.046 |
| 1647 | 7.046 |
| 1648 | 7.046 |
| 1649 | 7.046 |
| 1650 | 7.046 |
| 1651 | 7.046 |
| 1652 | 7.046 |
| 1653 | 7.046 |
| 1654 | 7.046 |
| 1655 | 7.046 |
| 1656 | 7.046 |
| 1657 | 7.046 |
| 1658 | 7.046 |
| 1659 | 7.046 |
| 1660 | 7.046 |
| 1661 | 7.046 |
| 1662 | 7.046 |
| 1663 | 7.046 |
| 1664 | 7.046 |
| 1665 | 7.046 |
| 1666 | 7.046 |
| 1667 | 7.046 |
| 1668 | 7.046 |
| 1669 | 7.046 |
| 1670 | 7.046 |
| 1671 | 7.046 |
| 1672 | 7.046 |
| 1673 | 7.046 |
| 1674 | 7.046 |
| 1675 | 7.046 |
| 1676 | 7.046 |
| 1677 | 7.046 |
| 1678 | 7.046 |
| 1679 | 7.046 |
| 1680 | 7.046 |
| 1681 | 7.046 |
| 1682 | 7.046 |
| 1683 | 7.046 |
| 1684 | 7.046 |
| 1685 | 7.046 |
| 1686 | 7.046 |
| 1687 | 7.046 |
| 1688 | 7.046 |
| 1689 | 7.046 |
| 1690 | 7.046 |
| 1691 | 7.046 |
| 1692 | 7.046 |
| 1693 | 7.046 |
| 1694 | 7.046 |
| 1695 | 7.046 |
| 1696 | 7.046 |
| 1697 | 7.046 |
| 1698 | 7.046 |
| 1699 | 7.046 |
| 1700 | 7.046 |
| 1701 | 7.046 |
| 1702 | 7.046 |
| 1703 | 7.046 |
| 1704 | 7.046 |
| 1705 | 7.046 |
| 1706 | 7.046 |
| 1707 | 7.046 |
| 1708 | 7.046 |
| 1709 | 7.046 |
| 1710 | 7.046 |
| 1711 | 7.046 |
| 1712 | 7.046 |
| 1713 | 7.046 |
| 1714 | 7.046 |
| 1715 | 7.046 |
| 1716 | 7.046 |
| 1717 | 7.046 |
| 1718 | 7.046 |
| 1719 | 7.046 |
| 1720 | 7.046 |
| 1721 | 7.046 |
| 1722 | 7.046 |
| 1723 | 7.046 |
| 1724 | 7.046 |
| 1725 | 7.046 |
| 1726 | 7.046 |
| 1727 | 7.046 |
| 1728 | 7.046 |
| 1729 | 7.046 |
| 1730 | 7.046 |
| 1731 | 7.046 |
| 1732 | 7.046 |
| 1733 | 7.046 |
| 1734 | 7.046 |
| 1735 | 7.046 |
| 1736 | 7.046 |
| 1737 | 7.046 |
| 1738 | 7.046 |
| 1739 | 7.046 |
| 1740 | 7.046 |
| 1741 | 7.046 |
| 1742 | 7.046 |
| 1743 | 7.046 |
| 1744 | 7.046 |
| 1745 | 7.046 |
| 1746 | 7.046 |
| 1747 | 7.046 |
| 1748 | 7.046 |
| 1749 | 7.046 |
| 1750 | 7.046 |
| 1751 | 7.046 |
| 1752 | 7.046 |
| 1753 | 7.046 |
| 1754 | 7.046 |
| 1755 | 7.046 |
| 1756 | 7.046 |
| 1757 | 7.046 |
| 1758 | 7.046 |
| 1759 | 7.046 |
| 1760 | 7.046 |
| 1761 | 7.046 |
| 1762 | 7.046 |
| 1763 | 7.046 |
| 1764 | 7.046 |
| 1765 | 7.046 |
| 1766 | 7.046 |
| 1767 | 7.046 |
| 1768 | 7.046 |
| 1769 | 7.046 |
| 1770 | 7.046 |
| 1771 | 7.046 |
| 1772 | 7.046 |
| 1773 | 7.046 |
| 1774 | 7.046 |
| 1775 | 7.046 |
| 1776 | 7.046 |
| 1777 | 7.046 |
| 1778 | 7.046 |
| 1779 | 7.046 |
| 1780 | 7.046 |
| 1781 | 7.046 |
| 1782 | 7.046 |
| 1783 | 7.046 |
| 1784 | 7.046 |
| 1785 | 7.046 |
| 1786 | 7.046 |
| 1787 | 7.046 |
| 1788 | 7.046 |
| 1789 | 7.046 |
| 1790 | 7.046 |
| 1791 | 7.046 |
| 1792 | 7.046 |
| 1793 | 7.046 |
| 1794 | 7.046 |
| 1795 | 7.046 |
| 1796 | 7.046 |
| 1797 | 7.046 |
| 1798 | 7.046 |
| 1799 | 7.046 |
| 1800 | 7.046 |
| 1801 | 7.046 |
| 1802 | 7.046 |
| 1803 | 7.046 |
| 1804 | 7.046 |
| 1805 | 7.046 |
| 1806 | 7.046 |
| 1807 | 7.046 |
| 1808 | 7.046 |
| 1809 | 7.046 |
| 1810 | 7.046 |
| 1811 | 7.046 |
| 1812 | 7.046 |
| 1813 | 7.046 |
| 1814 | 7.046 |
| 1815 | 7.046 |
| 1816 | 7.046 |
| 1817 | 7.046 |
| 1818 | 7.046 |
| 1819 | 7.046 |
| 1820 | 7.046 |
| 1821 | 7.046 |
| 1822 | 7.046 |
| 1823 | 7.046 |
| 1824 | 7.046 |
| 1825 | 7.046 |
| 1826 | 7.046 |
| 1827 | 7.046 |
| 1828 | 7.046 |
| 1829 | 7.046 |
| 1830 | 7.046 |
| 1831 | 7.046 |
| 1832 | 7.046 |
| 1833 | 7.046 |
| 1834 | 7.046 |
| 1835 | 7.046 |
| 1836 | 7.046 |
| 1837 | 7.046 |
| 1838 | 7.046 |
| 1839 | 7.046 |
| 1840 | 7.046 |
| 1841 | 7.046 |
| 1842 | 7.046 |
| 1843 | 7.046 |
| 1844 | 7.046 |
| 1845 | 7.046 |
| 1846 | 7.046 |
| 1847 | 7.046 |
| 1848 | 7.046 |
| 1849 | 7.046 |
| 1850 | 7.046 |
| 1851 | 7.046 |
| 1852 | 7.046 |
| 1853 | 7.046 |
| 1854 | 7.046 |
| 1855 | 7.046 |
| 1856 | 7.046 |
| 1857 | 7.046 |
| 1858 | 7.046 |
| 1859 | 7.046 |
| 1860 | 7.046 |
| 1861 | 7.046 |
| 1862 | 7.046 |
| 1863 | 7.046 |
| 1864 | 7.046 |
| 1865 | 7.046 |
| 1866 | 7.046 |
| 1867 | 7.046 |
| 1868 | 7.046 |
| 1869 | 7.046 |
| 1870 | 7.046 |
| 1871 | 7.046 |
| 1872 | 7.046 |
| 1873 | 7.046 |
| 1874 | 7.046 |
| 1875 | 7.046 |
| 1876 | 7.046 |
| 1877 | 7.046 |
| 1878 | 7.046 |
| 1879 | 7.046 |
| 1880 | 7.046 |
| 1881 | 7.046 |
| 1882 | 7.046 |
| 1883 | 7.046 |
| 1884 | 7.046 |
| 1885 | 7.046 |
| 1886 | 7.046 |
| 1887 | 7.046 |
| 1888 | 7.046 |
| 1889 | 7.046 |
| 1890 | 7.046 |
| 1891 | 7.046 |
| 1892 | 7.046 |
| 1893 | 7.046 |
| 1894 | 7.046 |
| 1895 | 7.046 |
| 1896 | 7.046 |
| 1897 | 7.046 |
| 1898 | 7.046 |
| 1899 | 7.046 |
| 1900 | 7.046 |
| 1901 | 7.046 |
| 1902 | 7.046 |
| 1903 | 7.046 |
| 1904 | 7.046 |
| 1905 | 7.046 |
| 1906 | 7.046 |
| 1907 | 7.046 |
| 1908 | 7.046 |
| 1909 | 7.046 |
| 1910 | 7.046 |
| 1911 | 7.046 |
| 1912 | 7.046 |
| 1913 | 7.046 |
| 1914 | 7.046 |
| 1915 | 7.046 |
| 1916 | 7.046 |
| 1917 | 7.046 |
| 1918 | 7.046 |
| 1919 | 7.046 |
| 1920 | 7.046 |
| 1921 | 7.046 |
| 1922 | 7.046 |
| 1923 | 7.046 |
| 1924 | 7.046 |
| 1925 | 7.046 |
| 1926 | 7.046 |
| 1927 | 7.046 |
| 1928 | 7.046 |
| 1929 | 7.046 |
| 1930 | 7.046 |
| 1931 | 7.046 |
| 1932 | 7.046 |
| 1933 | 7.046 |
| 1934 | 7.046 |
| 1935 | 7.046 |
| 1936 | 7.046 |
| 1937 | 7.046 |
| 1938 | 7.046 |
| 1939 | 7.046 |
| 1940 | 7.046 |
| 1941 | 7.046 |
| 1942 | 7.046 |
| 1943 | 7.046 |
| 1944 | 7.046 |
| 1945 | 7.046 |
| 1946 | 7.046 |
| 1947 | 7.046 |
| 1948 | 7.046 |
| 1949 | 7.046 |
| 1950 | 7.046 |
| 1951 | 7.046 |
| 1952 | 7.046 |
| 1953 | 7.046 |
| 1954 | 7.046 |
| 1955 | 7.046 |
| 1956 | 7.046 |
| 1957 | 7.046 |
| 1958 | 7.046 |
| 1959 | 7.046 |
| 1960 | 7.046 |
| 1961 | 7.046 |
| 1962 | 7.046 |
| 1963 | 7.046 |
| 1964 | 7.046 |
| 1965 | 7.046 |
| 1966 | 7.046 |
| 1967 | 7.046 |
| 1968 | 7.046 |
| 1969 | 7.046 |
| 1970 | 7.046 |
| 1971 | 7.046 |
| 1972 | 7.046 |
| 1973 | 7.046 |
| 1974 | 7.046 |
| 1975 | 7.046 |
| 1976 | 7.046 |
| 1977 | 7.046 |
| 1978 | 7.046 |
| 1979 | 7.046 |
| 1980 | 7.046 |
| 1981 | 7.046 |
| 1982 | 7.046 |
| 1983 | 7.046 |
| 1984 | 7.046 |
| 1985 | 7.046 |
| 1986 | 7.046 |
| 1987 | 7.046 |
| 1988 | 7.046 |
| 1989 | 7.046 |
| 1990 | 7.046 |
| 1991 | 7.046 |
| 1992 | 7.046 |
| 1993 | 7.046 |
| 1994 | 7.046 |
| 1995 | 7.046 |
| 1996 | 7.046 |
| 1997 | 7.046 |
| 1998 | 7.046 |
| 1999 | 7.046 |
| 2000 | 7.046 |
| 2001 | 7.046 |
| 2002 | 7.046 |
| 2003 | 7.046 |
| 2004 | 7.046 |
| 2005 | 7.046 |
| 2006 | 7.046 |
| 2007 | 7.046 |
| 2008 | 7.046 |
| 2009 | 7.046 |
| 2010 | 7.046 |
| 2011 | 7.046 |
| 2012 | 7.046 |
| 2013 | 7.046 |
| 2014 | 7.046 |
| 2015 | 7.046 |
| 2016 | 7.046 |
| 2017 | 7.046 |
| 2018 | 7.046 |
| 2019 | 7.046 |
| 2020 | 7.046 |
| 2021 | 7.046 |
| 2022 | 7.046 |
| 2023 | 7.046 |
| 2024 | 7.046 |
| 2025 | 7.046 |
| 2026 | 7.046 |
| 2027 | 7.046 |
| 2028 | 7.046 |
| 2029 | 7.046 |
| 2030 | 7.046 |
| 2031 | 7.046 |
| 2032 | 7.046 |
| 2033 | 7.046 |
| 2034 | 7.046 |
| 2035 | 7.046 |
| 2036 | 7.046 |
| 2037 | 7.046 |
| 2038 | 7.046 |
| 2039 | 7.046 |
| 2040 | 7.046 |
| 2041 | 7.046 |
| 2042 | 7.046 |
| 2043 | 7.046 |
| 2044 | 7.046 |
| 2045 | 7.046 |
| 2046 | 7.046 |
| 2047 | 7.046 |
| 2048 | 7.046 |
| 2049 | 7.046 |
| 2050 | 7.046 |
| 2051 | 7.046 |
| 2052 | 7.046 |
| 2053 | 7.046 |
| 2054 | 7.046 |
| 2055 | 7.046 |
| 2056 | 7.046 |
| 2057 | 7.046 |
| 2058 | 7.046 |
| 2059 | 7.046 |
| 2060 | 7.046 |
| 2061 | 7.046 |
| 2062 | 7.046 |
| 2063 | 7.046 |
| 2064 | 7.046 |
| 2065 | 7.046 |
| 2066 | 7.046 |
| 2067 | 7.046 |
| 2068 | 7.046 |
| 2069 | 7.046 |
| 2070 | 7.046 |
| 2071 | 7.046 |
| 2072 | 7.046 |
| 2073 | 7.046 |
| 2074 | 7.046 |
| 2075 | 7.046 |
| 2076 | 7.046 |
| 2077 | 7.046 |
| 2078 | 7.046 |
| 2079 | 7.046 |
| 2080 | 7.046 |
| 2081 | 7.046 |
| 2082 | 7.046 |
| 2083 | 7.046 |
| 2084 | 7.046 |
| 2085 | 7.046 |
| 2086 | 7.046 |
| 2087 | 7.046 |
| 2088 | 7.046 |
| 2089 | 7.046 |
| 2090 | 7.046 |
| 2091 | 7.046 |
| 2092 | 7.046 |
| 2093 | 7.046 |
| 2094 | 7.046 |
| 2095 | 7.046 |
| 2096 | 7.046 |
| 2097 | 7.046 |
| 2098 | 7.046 |
| 2099 | 7.046 |
| 2100 | 7.046 |
| 2101 | 7.046 |
| 2102 | 7.046 |
| 2103 | 7.046 |
| 2104 | 7.046 |
| 2105 | 7.046 |
| 2106 | 7.046 |
| 2107 | 7.046 |
| 2108 | 7.046 |
| 2109 | 7.046 |
| 2110 | 7.046 |
| 2111 | 7.046 |
| 2112 | 7.046 |
| 2113 | 7.046 |
| 2114 | 7.046 |
| 2115 | 7.046 |
| 2116 | 7.046 |
| 2117 | 7.046 |
| 2118 | 7.046 |
| 2119 | 7.046 |
| 2120 | 7.046 |
| 2121 | 7.046 |
| 2122 | 7.046 |
| 2123 | 7.046 |
| 2124 | 7.046 |
| 2125 | 7.046 |
| 2126 | 7.046 |
| 2127 | 7.046 |
| 2128 | 7.046 |
| 2129 | 7.046 |
| 2130 | 7.046 |
| 2131 | 7.046 |
| 2132 | 7.046 |
| 2133 | 7.046 |
| 2134 | 7.046 |
| 2135 | 7.046 |
| 2136 | 7.046 |
| 2137 | 7.046 |
| 2138 | 7.046 |
| 2139 | 7.046 |
| 2140 | 7.046 |
| 2141 | 7.046 |
| 2142 | 7.046 |
| 2143 | 7.046 |
| 2144 | 7.046 |
| 2145 | 7.046 |
| 2146 | 7.046 |
| 2147 | 7.046 |
| 2148 | 7.046 |
| 2149 | 7.046 |
| 2150 | 7.046 |
| 2151 | 7.046 |
| 2152 | 7.046 |
| 2153 | 7.046 |
| 2154 | 7.046 |
| 2155 | 7.046 |
| 2156 | 7.046 |
| 2157 | 7.046 |
| 2158 | 7.046 |
| 2159 | 7.046 |
| 2160 | 7.046 |
| 2161 | 7.046 |
| 2162 | 7.046 |
| 2163 | 7.046 |
| 2164 | 7.046 |
| 2165 | 7.046 |
| 2166 | 7.046 |
| 2167 | 7.046 |
| 2168 | 7.046 |
| 2169 | 7.046 |
| 2170 | 7.046 |
| 2171 | 7.046 |
| 2172 | 7.046 |
| 2173 | 7.046 |
| 2174 | 7.046 |
| 2175 | 7.046 |
| 2176 | 7.046 |
| 2177 | 7.046 |
| 2178 | 7.046 |
| 2179 | 7.046 |
| 2180 | 7.046 |
| 2181 | 7.046 |
| 2182 | 7.046 |
| 2183 | 7.046 |
| 2184 | 7.046 |
| 2185 | 7.046 |
| 2186 | 7.046 |
| 2187 | 7.046 |
| 2188 | 7.046 |
| 2189 | 7.046 |
| 2190 | 7.046 |
| 2191 | 7.046 |
| 2192 | 7.046 |
| 2193 | 7.046 |
| 2194 | 7.046 |
| 2195 | 7.046 |
| 2196 | 7.046 |
| 2197 | 7.046 |
| 2198 | 7.046 |
| 2199 | 7.046 |
| 2200 | 7.046 |
| 2201 | 7.046 |
| 2202 | 7.046 |
| 2203 | 7.046 |
| 2204 | 7.046 |
| 2205 | 7.046 |
| 2206 | 7.046 |
| 2207 | 7.046 |
| 2208 | 7.046 |
| 2209 | 7.046 |
| 2210 | 7.046 |
| 2211 | 7.046 |
| 2212 | 7.046 |
| 2213 | 7.046 |
| 2214 | 7.046 |
| 2215 | 7.046 |
| 2216 | 7.046 |
| 2217 | 7.046 |
| 2218 | 7.046 |
| 2219 | 7.046 |
| 2220 | 7.046 |
| 2221 | 7.046 |
| 2222 | 7.046 |
| 2223 | 7.046 |
| 2224 | 7.046 |
| 2225 | 7.046 |
| 2226 | 7.046 |
| 2227 | 7.046 |
| 2228 | 7.046 |
| 2229 | 7.046 |
| 2230 | 7.046 |
| 2231 | 7.046 |
| 2232 | 7.046 |
| 2233 | 7.046 |
| 2234 | 7.046 |
| 2235 | 7.046 |
| 2236 | 7.046 |
| 2237 | 7.046 |
| 2238 | 7.046 |
| 2239 | 7.046 |
| 2240 | 7.046 |
| 2241 | 7.046 |
| 2242 | 7.046 |
| 2243 | 7.046 |
| 2244 | 7.046 |
| 2245 | 7.046 |
| 2246 | 7.046 |
| 2247 | 7.046 |
| 2248 | 7.046 |
| 2249 | 7.046 |
| 2250 | 7.046 |
| 2251 | 7.046 |
| 2252 | 7.046 |
| 2253 | 7.046 |
| 2254 | 7.046 |
| 2255 | 7.046 |
| 2256 | 7.046 |
| 2257 | 7.046 |
| 2258 | 7.046 |
| 2259 | 7.046 |
| 2260 | 7.046 |
| 2261 | 7.046 |
| 2262 | 7.046 |
| 2263 | 7.046 |
| 2264 | 7.046 |
| 2265 | 7.046 |
| 2266 | 7.046 |
| 2267 | 7.046 |
| 2268 | 7.046 |
| 2269 | 7.046 |
| 2270 | 7.046 |
| 2271 | 7.046 |
| 2272 | 7.046 |
| 2273 | 7.046 |
| 2274 | 7.046 |
| 2275 | 7.046 |
| 2276 | 7.046 |
| 2277 | 7.046 |
| 2278 | 7.046 |
| 2279 | 7.046 |
| 2280 | 7.046 |
| 2281 | 7.046 |
| 2282 | 7.046 |
| 2283 | 7.046 |
| 2284 | 7.046 |
| 2285 | 7.046 |
| 2286 | 7.046 |
| 2287 | 7.046 |
| 2288 | 7.046 |
| 2289 | 7.046 |
| 2290 | 7.046 |
| 2291 | 7.046 |
| 2292 | 7.046 |
| 2293 | 7.046 |
| 2294 | 7.046 |
| 2295 | 7.046 |
| 2296 | 7.046 |
| 2297 | 7.046 |
| 2298 | 7.046 |
| 2299 | 7.046 |
| 2300 | 7.046 |
| 2301 | 7.046 |
| 2302 | 7.046 |
| 2303 | 7.046 |
| 2304 | 7.046 |
| 2305 | 7.046 |
| 2306 | 7.046 |
| 2307 | 7.046 |
| 2308 | 7.046 |
| 2309 | 7.046 |
| 2310 | 7.046 |
| 2311 | 7.046 |
| 2312 | 7.046 |
| 2313 | 7.046 |
| 2314 | 7.046 |
| 2315 | 7.046 |
| 2316 | 7.046 |
| 2317 | 7.046 |
| 2318 | 7.046 |
| 2319 | 7.046 |
| 2320 | 7.046 |
| 2321 | 7.046 |
| 2322 | 7.046 |
| 2323 | 7.046 |
| 2324 | 7.046 |
| 2325 | 7.046 |
| 2326 | 7.046 |
| 2327 | 7.046 |
| 2328 | 7.046 |
| 2329 | 7.046 |
| 2330 | 7.046 |
| 2331 | 7.046 |
| 2332 | 7.046 |
| 2333 | 7.046 |
| 2334 | 7.046 |
| 2335 | 7.046 |
| 2336 | 7.046 |
| 2337 | 7.046 |
| 2338 | 7.046 |
| 2339 | 7.046 |
| 2340 | 7.046 |
| 2341 | 7.046 |
| 2342 | 7.046 |
| 2343 | 7.046 |
| 2344 | 7.046 |
| 2345 | 7.046 |
| 2346 | 7.046 |
| 2347 | 7.046 |
| 2348 | 7.046 |
| 2349 | 7.046 |
| 2350 | 7.046 |
| 2351 | 7.046 |
| 2352 | 7.046 |
| 2353 | 7.046 |
| 2354 | 7.046 |
| 2355 | 7.046 |
| 2356 | 7.046 |
| 2357 | 7.046 |
| 2358 | 7.046 |
| 2359 | 7.046 |
| 2360 | 7.046 |
| 2361 | 7.046 |
| 2362 | 7.046 |
| 2363 | 7.046 |
| 2364 | 7.046 |
| 2365 | 7.046 |
| 2366 | 7.046 |
| 2367 | 7.046 |
| 2368 | 7.046 |
| 2369 | 7.046 |
| 2370 | 7.046 |
| 2371 | 7.046 |
| 2372 | 7.046 |
| 2373 | 7.046 |
| 2374 | 7.046 |
| 2375 | 7.046 |
| 2376 | 7.046 |
| 2377 | 7.046 |
| 2378 | 7.046 |
| 2379 | 7.046 |
| 2380 | 7.046 |
| 2381 | 7.046 |
| 2382 | 7.046 |
| 2383 | 7.046 |
| 2384 | 7.046 |
| 2385 | 7.046 |
| 2386 | 7.046 |
| 2387 | 7.046 |
| 2388 | 7.046 |
| 2389 | 7.046 |
| 2390 | 7.046 |
| 2391 | 7.046 |
| 2392 | 7.046 |
| 2393 | 7.046 |
| 2394 | 7.046 |
| 2395 | 7.046 |
| 2396 | 7.046 |
| 2397 | 7.046 |
| 2398 | 7.046 |
| 2399 | 7.046 |
| 2400 | 7.046 |
| 2401 | 7.046 |
| 2402 | 7.046 |
| 2403 | 7.046 |
| 2404 | 7.046 |
| 2405 | 7.046 |
| 2406 | 7.046 |
| 2407 | 7.046 |
| 2408 | 7.046 |
| 2409 | 7.046 |
| 2410 | 7.046 |
| 2411 | 7.046 |
| 2412 | 7.046 |
| 2413 | 7.046 |
| 2414 | 7.046 |
| 2415 | 7.046 |
| 2416 | 7.046 |
| 2417 | 7.046 |
| 2418 | 7.046 |
| 2419 | 7.046 |
| 2420 | 7.046 |
| 2421 | 7.046 |
| 2422 | 7.046 |
| 2423 | 7.046 |
| 2424 | 7.046 |
| 2425 | 7.046 |
| 2426 | 7.046 |
| 2427 | 7.046 |
| 2428 | 7.046 |
| 2429 | 7.046 |
| 2430 | 7.046 |
| 2431 | 7.046 |
| 2432 | 7.046 |
| 2433 | 7.046 |
| 2434 | 7.046 |
| 2435 | 7.046 |
| 2436 | 7.046 |
| 2437 | 7.046 |
| 2438 | 7.046 |
| 2439 | 7.046 |
| 2440 | 7.046 |
| 2441 | 7.046 |
| 2442 | 7.046 |
| 2443 | 7.046 |
| 2444 | 7.046 |
| 2445 | 7.046 |
| 2446 | 7.046 |
| 2447 | 7.046 |
| 2448 | 7.046 |
| 2449 | 7.046 |
| 2450 | 7.046 |
| 2451 | 7.046 |
| 2452 | 7.046 |
| 2453 | 7.046 |
| 2454 | 7.046 |
| 2455 | 7.046 |
| 2456 | 7.046 |
| 2457 | 7.046 |
| 2458 | 7.046 |
| 2459 | 7.046 |
| 2460 | 7.046 |
| 2461 | 7.046 |
| 2462 | 7.046 |
| 2463 | 7.046 |
| 2464 | 7.046 |
| 2465 | 7.046 |
| 2466 | 7.046 |
| 2467 | 7.046 |
| 2468 | 7.046 |
| 2469 | 7.046 |
| 2470 | 7.046 |
| 2471 | 7.046 |
| 2472 | 7.046 |
| 2473 | 7.046 |
| 2474 | 7.046 |
| 2475 | 7.046 |
| 2476 | 7.046 |
| 2477 | 7.046 |
| 2478 | 7.046 |
| 2479 | 7.046 |
| 2480 | 7.046 |
| 2481 | 7.046 |
| 2482 | 7.046 |
| 2483 | 7.046 |
| 2484 | 7.046 |
| 2485 | 7.046 |
| 2486 | 7.046 |
| 2487 | 7.046 |
| 2488 | 7.046 |
| 2489 | 7.046 |
| 2490 | 7.046 |
| 2491 | 7.046 |
| 2492 | 7.046 |
| 2493 | 7.046 |
| 2494 | 7.046 |
| 2495 | 7.046 |
| 2496 | 7.046 |
| 2497 | 7.046 |
| 2498 | 7.046 |
| 2499 | 7.046 |
| 2500 | 7.046 |
| 2501 | 7.046 |
| 2502 | 7.046 |
| 2503 | 7.046 |
| 2504 | 7.046 |
| 2505 | 7.046 |
| 2506 | 7.046 |
| 2507 | 7.046 |
| 2508 | 7.046 |
| 2509 | 7.046 |
| 2510 | 7.046 |
| 2511 | 7.046 |
| 2512 | 7.046 |
| 2513 | 7.046 |
| 2514 | 7.046 |
| 2515 | 7.046 |
| 2516 | 7.046 |
| 2517 | 7.046 |
| 2518 | 7.046 |
| 2519 | 7.046 |
| 2520 | 7.046 |
| 2521 | 7.046 |
| 2522 | 7.046 |
| 2523 | 7.046 |
| 2524 | 7.046 |
| 2525 | 7.046 |
| 2526 | 7.046 |
| 2527 | 7.046 |
| 2528 | 7.046 |
| 2529 | 7.046 |
| 2530 | 7.046 |
| 2531 | 7.046 |
| 2532 | 7.046 |
| 2533 | 7.046 |
| 2534 | 7.046 |
| 2535 | 7.046 |
| 2536 | 7.046 |
| 2537 | 7.046 |
| 2538 | 7.046 |
| 2539 | 7.046 |
| 2540 | 7.046 |
| 2541 | 7.046 |
| 2542 | 7.046 |
| 2543 | 7.046 |
| 2544 | 7.046 |
| 2545 | 7.046 |
| 2546 | 7.046 |
| 2547 | 7.046 |
| 2548 | 7.046 |
| 2549 | 7.046 |
| 2550 | 7.046 |
| 2551 | 7.046 |
| 2552 | 7.046 |
| 2553 | 7.046 |
| 2554 | 7.046 |
| 2555 | 7.046 |
| 2556 | 7.046 |
| 2557 | 7.046 |
| 2558 | 7.046 |
| 2559 | 7.046 |
| 2560 | 7.046 |
| 2561 | 7.046 |
| 2562 | 7.046 |
| 2563 | 7.046 |
| 2564 | 7.046 |
| 2565 | 7.046 |
| 2566 | 7.046 |
| 2567 | 7.046 |
| 2568 | 7.046 |
| 2569 | 7.046 |
| 2570 | 7.046 |
| 2571 | 7.046 |
| 2572 | 7.046 |
| 2573 | 7.046 |
| 2574 | 7.046 |
| 2575 | 7.046 |
| 2576 | 7.046 |
| 2577 | 7.046 |
| 2578 | 7.046 |
| 2579 | 7.046 |
| 2580 | 7.046 |
| 2581 | 7.046 |
| 2582 | 7.046 |
| 2583 | 7.046 |
| 2584 | 7.046 |
| 2585 | 7.046 |
| 2586 | 7.046 |
| 2587 | 7.046 |
| 2588 | 7.046 |
| 2589 | 7.046 |
| 2590 | 7.046 |
| 2591 | 7.046 |
| 2592 | 7.046 |
| 2593 | 7.046 |
| 2594 | 7.046 |
| 2595 | 7.046 |
| 2596 | 7.046 |
| 2597 | 7.046 |
| 2598 | 7.046 |
| 2599 | 7.046 |
| 2600 | 7.046 |
| 2601 | 7.046 |
| 2602 | 7.046 |
| 2603 | 7.046 |
| 2604 | 7.046 |
| 2605 | 7.046 |
| 2606 | 7.046 |
| 2607 | 7.046 |
| 2608 | 7.046 |
| 2609 | 7.046 |
| 2610 | 7.046 |
| 2611 | 7.046 |
| 2612 | 7.046 |
| 2613 | 7.046 |
| 2614 | 7.046 |
| 2615 | 7.046 |
| 2616 | 7.046 |
| 2617 | 7.046 |
| 2618 | 7.046 |
| 2619 | 7.046 |
| 2620 | 7.046 |
| 2621 | 7.046 |
| 2622 | 7.046 |
| 2623 | 7.046 |
| 2624 | 7.046 |
| 2625 | 7.046 |
| 2626 | 7.046 |
| 2627 | 7.046 |
| 2628 | 7.046 |
| 2629 | 7.046 |
| 2630 | 7.046 |
| 2631 | 7.046 |
| 2632 | 7.046 |
| 2633 | 7.046 |
| 2634 | 7.046 |
| 2635 | 7.046 |
| 2636 | 7.046 |
| 2637 | 7.046 |
| 2638 | 7.046 |
| 2639 | 7.046 |
| 2640 | 7.046 |
| 2641 | 7.046 |
| 2642 | 7.046 |
| 2643 | 7.046 |
| 2644 | 7.046 |
| 2645 | 7.046 |
| 2646 | 7.046 |
| 2647 | 7.046 |
| 2648 | 7.046 |
| 2649 | 7.046 |
| 2650 | 7.046 |
| 2651 | 7.046 |
| 2652 | 7.046 |
| 2653 | 7.046 |
| 2654 | 7.046 |
| 2655 | 7.046 |
| 2656 | 7.046 |
| 2657 | 7.046 |
| 2658 | 7.046 |
| 2659 | 7.046 |
| 2660 | 7.046 |
| 2661 | 7.046 |
| 2662 | 7.046 |
| 2663 | 7.046 |
| 2664 | 7.046 |
| 2665 | 7.046 |
| 2666 | 7.046 |
| 2667 | 7.046 |
| 2668 | 7.046 |
| 2669 | 7.046 |
| 2670 | 7.046 |
| 2671 | 7.046 |
| 2672 | 7.046 |
| 2673 | 7.046 |
| 2674 | 7.046 |
| 2675 | 7.046 |
| 2676 | 7.046 |
| 2677 | 7.046 |
| 2678 | 7.046 |
| 2679 | 7.046 |
| 2680 | 7.046 |
| 2681 | 7.046 |
| 2682 | 7.046 |
| 2683 | 7.046 |
| 2684 | 7.046 |
| 2685 | 7.046 |
| 2686 | 7.046 |
| 2687 | 7.046 |
| 2688 | 7.046 |
| 2689 | 7.046 |
| 2690 | 7.046 |
| 2691 | 7.046 |
| 2692 | 7.046 |
| 2693 | 7.046 |
| 2694 | 7.046 |
| 2695 | 7.046 |
| 2696 | 7.046 |
| 2697 | 7.046 |
| 2698 | 7.046 |
| 2699 | 7.046 |
| 2700 | 7.046 |
| 2701 | 7.046 |
| 2702 | 7.046 |
| 2703 | 7.046 |
| 2704 | 7.046 |
| 2705 | 7.046 |
| 2706 | 7.046 |
| 2707 | 7.046 |
| 2708 | 7.046 |
| 2709 | 7.046 |
| 2710 | 7.046 |
| 2711 | 7.046 |
| 2712 | 7.046 |
| 2713 | 7.046 |
| 2714 | 7.046 |
| 2715 | 7.046 |
| 2716 | 7.046 |
| 2717 | 7.046 |
| 2718 | 7.046 |
| 2719 | 7.046 |
| 2720 | 7.046 |
| 2721 | 7.046 |
| 2722 | 7.046 |
| 2723 | 7.046 |
| 2724 | 7.046 |
| 2725 | 7.046 |
| 2726 | 7.046 |
| 2727 | 7.046 |
| 2728 | 7.046 |
| 2729 | 7.046 |
| 2730 | 7.046 |
| 2731 | 7.046 |
| 2732 | 7.046 |
| 2733 | 7.046 |
| 2734 | 7.046 |
| 2735 | 7.046 |
| 2736 | 7.046 |
| 2737 | 7.046 |
| 2738 | 7.046 |
| 2739 | 7.046 |
| 2740 | 7.046 |
| 2741 | 7.046 |
| 2742 | 7.046 |
| 2743 | 7.046 |
| 2744 | 7.046 |
| 2745 | 7.046 |
| 2746 | 7.046 |
| 2747 | 7.046 |
| 2748 | 7.046 |
| 2749 | 7.046 |
| 2750 | 7.046 |
| 2751 | 7.046 |
| 2752 | 7.046 |
| 2753 | 7.046 |
| 2754 | 7.046 |
| 2755 | 7.046 |
| 2756 | 7.046 |
| 2757 | 7.046 |
| 2758 | 7.046 |
| 2759 | 7.046 |
| 2760 | 7.046 |
| 2761 | 7.046 |
| 2762 | 7.046 |
| 2763 | 7.046 |
| 2764 | 7.046 |
| 2765 | 7.046 |
| 2766 | 7.046 |
| 2767 | 7.046 |
| 2768 | 7.046 |
| 2769 | 7.046 |
| 2770 | 7.046 |
| 2771 | 7.046 |
| 2772 | 7.046 |
| 2773 | 7.046 |
| 2774 | 7.046 |
| 2775 | 7.046 |
| 2776 | 7.046 |
| 2777 | 7.046 |
| 2778 | 7.046 |
| 2779 | 7.046 |
| 2780 | 7.046 |
| 2781 | 7.046 |
| 2782 | 7.046 |
| 2783 | 7.046 |
| 2784 | 7.046 |
| 2785 | 7.046 |
| 2786 | 7.046 |
| 2787 | 7.046 |
| 2788 | 7.046 |
| 2789 | 7.046 |
| 2790 | 7.046 |
| 2791 | 7.046 |
| 2792 | 7.046 |
| 2793 | 7.046 |
| 2794 | 7.046 |
| 2795 | 7.046 |
| 2796 | 7.046 |
| 2797 | 7.046 |
| 2798 | 7.046 |
| 2799 | 7.046 |
| 2800 | 7.046 |
| 2801 | 7.046 |
| 2802 | 7.046 |
| 2803 | 7.046 |
| 2804 | 7.046 |
| 2805 | 7.046 |
| 2806 | 7.046 |
| 2807 | 7.046 |
| 2808 | 7.046 |
| 2809 | 7.046 |
| 2810 | 7.046 |
| 2811 | 7.046 |
| 2812 | 7.046 |
| 2813 | 7.046 |
| 2814 | 7.046 |
| 2815 | 7.046 |
| 2816 | 7.046 |
| 2817 | 7.046 |
| 2818 | 7.046 |
| 2819 | 7.046 |
| 2820 | 7.046 |
| 2821 | 7.046 |
| 2822 | 7.046 |
| 2823 | 7.046 |
| 2824 | 7.046 |
| 2825 | 7.046 |
| 2826 | 7.046 |
| 2827 | 7.046 |
| 2828 | 7.046 |
| 2829 | 7.046 |
| 2830 | 7.046 |
| 2831 | 7.046 |
| 2832 | 7.046 |
| 2833 | 7.046 |
| 2834 | 7.046 |
| 2835 | 7.046 |
| 2836 | 7.046 |
| 2837 | 7.046 |
| 2838 | 7.046 |
| 2839 | 7.046 |
| 2840 | 7.046 |
| 2841 | 7.046 |
| 2842 | 7.046 |
| 2843 | 7.046 |
| 2844 | 7.046 |
| 2845 | 7.046 |
| 2846 | 7.046 |
| 2847 | 7.046 |
| 2848 | 7.046 |
| 2849 | 7.046 |
| 2850 | 7.046 |
| 2851 | 7.046 |
| 2852 | 7.046 |
| 2853 | 7.046 |
| 2854 | 7.046 |
| 2855 | 7.046 |
| 2856 | 7.046 |
| 2857 | 7.046 |
| 2858 | 7.046 |
| 2859 | 7.046 |
| 2860 | 7.046 |
| 2861 | 7.046 |
| 2862 | 7.046 |
| 2863 | 7.046 |
| 2864 | 7.046 |
| 2865 | 7.046 |
| 2866 | 7.046 |
| 2867 | 7.046 |
| 2868 | 7.046 |
| 2869 | 7.046 |
| 2870 | 7.046 |
| 2871 | 7.046 |
| 2872 | 7.046 |
| 2873 | 7.046 |
| 2874 | 7.046 |
| 2875 | 7.046 |
| 2876 | 7.046 |
| 2877 | 7.046 |
| 2878 | 7.046 |
| 2879 | 7.046 |
| 2880 | 7.046 |
| 2881 | 7.046 |
| 2882 | 7.046 |
| 2883 | 7.046 |
| 2884 | 7.046 |
| 2885 | 7.046 |
| 2886 | 7.046 |
| 2887 | 7.046 |
| 2888 | 7.046 |
| 2889 | 7.046 |
| 2890 | 7.046 |
| 2891 | 7.046 |
| 2892 | 7.046 |
| 2893 | 7.046 |
| 2894 | 7.046 |
| 2895 | 7.046 |
| 2896 | 7.046 |
| 2897 | 7.046 |
| 2898 | 7.046 |
| 2899 | 7.046 |
| 2900 | 7.046 |
| 2901 | 7.046 |
| 2902 | 7.046 |
| 2903 | 7.046 |
| 2904 | 7.046 |
| 2905 | 7.046 |
| 2906 | 7.046 |
| 2907 | 7.046 |
| 2908 | 7.046 |
| 2909 | 7.046 |
| 2910 | 7.046 |
| 2911 | 7.046 |
| 2912 | 7.046 |
| 2913 | 7.046 |
| 2914 | 7.046 |
| 2915 | 7.046 |
| 2916 | 7.046 |
| 2917 | 7.046 |
| 2918 | 7.046 |
| 2919 | 7.046 |
| 2920 | 7.046 |
| 2921 | 7.046 |
| 2922 | 7.046 |
| 2923 | 7.046 |
| 2924 | 7.046 |
| 2925 | 7.046 |
| 2926 | 7.046 |
| 2927 | 7.046 |
| 2928 | 7.046 |
| 2929 | 7.046 |
| 2930 | 7.046 |
| 2931 | 7.046 |
| 2932 | 7.046 |
| 2933 | 7.046 |
| 2934 | 7.046 |
| 2935 | 7.046 |
| 2936 | 7.046 |
| 2937 | 7.046 |
| 2938 | 7.046 |
| 2939 | 7.046 |
| 2940 | 7.046 |
| 2941 | 7.046 |
| 2942 | 7.046 |
| 2943 | 7.046 |
| 2944 | 7.046 |
| 2945 | 7.046 |
| 2946 | 7.046 |
| 2947 | 7.046 |
| 2948 | 7.046 |
| 2949 | 7.046 |
| 2950 | 7.046 |
| 2951 | 7.046 |
| 2952 | 7.046 |
| 2953 | 7.046 |
| 2954 | 7.046 |
| 2955 | 7.046 |
| 2956 | 7.046 |
| 2957 | 7.046 |
| 2958 | 7.046 |
| 2959 | 7.046 |
| 2960 | 7.046 |
| 2961 | 7.046 |
| 2962 | 7.046 |
| 2963 | 7.046 |
| 2964 | 7.046 |
| 2965 | 7.046 |
| 2966 | 7.046 |
| 2967 | 7.046 |
| 2968 | 7.046 |
| 2969 | 7.046 |
| 2970 | 7.046 |
| 2971 | 7.046 |
| 2972 | 7.046 |
| 2973 | 7.046 |
| 2974 | 7.046 |
| 2975 | 7.046 |
| 2976 | 7.046 |
| 2977 | 7.046 |
| 2978 | 7.046 |
| 2979 | 7.046 |
| 2980 | 7.046 |
| 2981 | 7.046 |
| 2982 | 7.046 |
| 2983 | 7.046 |
| 2984 | 7.046 |
| 2985 | 7.046 |
| 2986 | 7.046 |
| 2987 | 7.046 |
| 2988 | 7.046 |
| 2989 | 7.046 |
| 2990 | 7.046 |
| 2991 | 7.046 |
| 2992 | 7.046 |
| 2993 | 7.046 |
| 2994 | 7.046 |
| 2995 | 7.046 |
| 2996 | 7.046 |
| 2997 | 7.046 |
| 2998 | 7.046 |
| 2999 | 7.046 |
| 3000 | 7.046 |
| 3001 | 7.046 |
| 3002 | 7.046 |
| 3003 | 7.046 |
| 3004 | 7.046 |
| 3005 | 7.046 |
| 3006 | 7.046 |
| 3007 | 7.046 |
| 3008 | 7.046 |
| 3009 | 7.046 |
| 3010 | 7.046 |
| 3011 | 7.046 |
| 3012 | 7.046 |
| 3013 | 7.046 |
| 3014 | 7.046 |
| 3015 | 7.046 |
| 3016 | 7.046 |
| 3017 | 7.046 |
| 3018 | 7.046 |
| 3019 | 7.046 |
| 3020 | 7.046 |
| 3021 | 7.046 |
| 3022 | 7.046 |
| 3023 | 7.046 |
| 3024 | 7.046 |
| 3025 | 7.046 |
| 3026 | 7.046 |
| 3027 | 7.046 |
| 3028 | 7.046 |
| 3029 | 7.046 |
| 3030 | 7.046 |
| 3031 | 7.046 |
| 3032 | 7.046 |
| 3033 | 7.046 |
| 3034 | 7.046 |
| 3035 | 7.046 |
| 3036 | 7.046 |
| 3037 | 7.046 |
| 3038 | 7.046 |